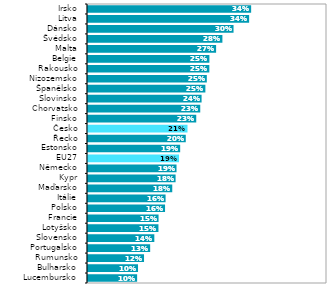
| Category | Series 1 |
|---|---|
| Lucembursko | 0.103 |
| Bulharsko | 0.105 |
| Rumunsko | 0.117 |
| Portugalsko | 0.13 |
| Slovensko | 0.139 |
| Lotyšsko | 0.147 |
| Francie | 0.148 |
| Polsko | 0.161 |
| Itálie | 0.162 |
| Maďarsko | 0.176 |
| Kypr | 0.183 |
| Německo | 0.185 |
| EU27 | 0.19 |
| Estonsko | 0.193 |
| Řecko | 0.205 |
| Česko | 0.208 |
| Finsko | 0.226 |
| Chorvatsko | 0.235 |
| Slovinsko | 0.238 |
| Španělsko | 0.246 |
| Nizozemsko | 0.249 |
| Rakousko | 0.254 |
| Belgie | 0.254 |
| Malta | 0.268 |
| Švédsko | 0.281 |
| Dánsko | 0.304 |
| Litva | 0.337 |
| Irsko | 0.341 |